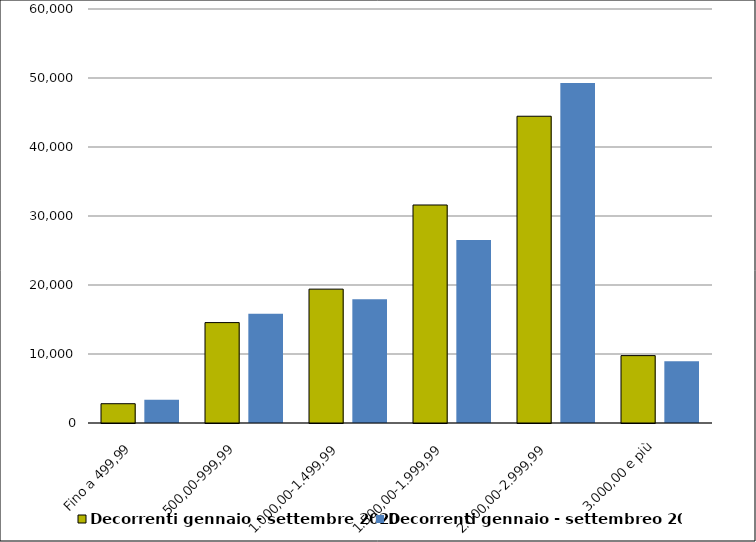
| Category | Decorrenti gennaio - settembre 2020 | Decorrenti gennaio - settembreo 2019 |
|---|---|---|
| Fino a 499,99 | 2795 | 3358 |
| 500,00-999,99 | 14551 | 15822 |
| 1.000,00-1.499,99 | 19401 | 17928 |
| 1.500,00-1.999,99 | 31596 | 26514 |
| 2.000,00-2.999,99 | 44457 | 49285 |
| 3.000,00 e più | 9766 | 8964 |